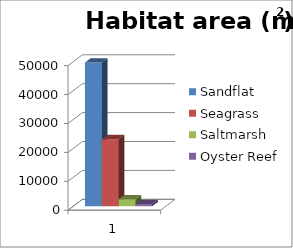
| Category | Sandflat | Seagrass | Saltmarsh | Oyster Reef |
|---|---|---|---|---|
| 0 | 49680 | 23160 | 2400 | 700 |